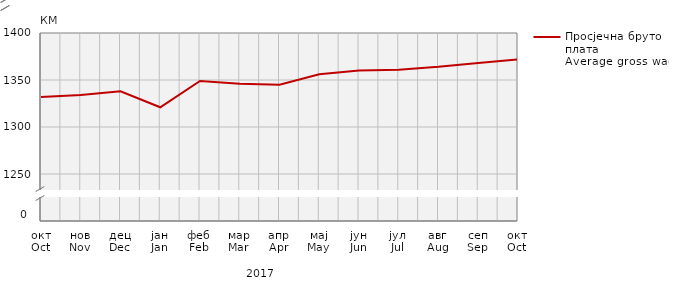
| Category | Просјечна бруто плата
Average gross wage |
|---|---|
| окт
Oct | 1332 |
| нов
Nov | 1334 |
| дец
Dec | 1338 |
| јан
Jan | 1321 |
| феб
Feb | 1349 |
| мар
Mar | 1346 |
| апр
Apr | 1345 |
| мај
May | 1356 |
| јун
Jun | 1360 |
| јул
Jul | 1361 |
| авг
Aug | 1364 |
| сеп
Sep | 1368 |
| окт
Oct | 1372 |